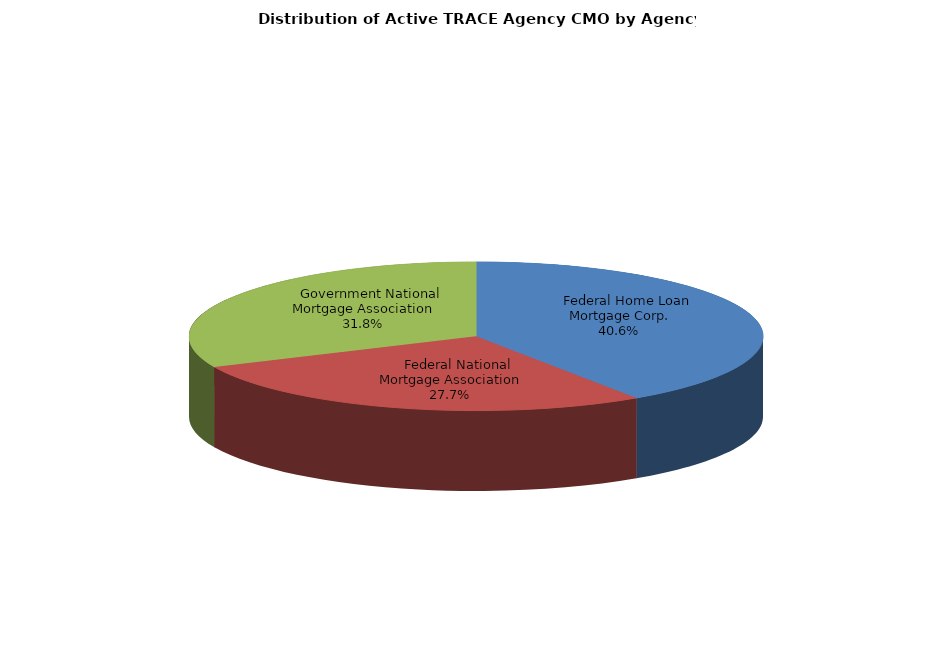
| Category | Series 0 |
|---|---|
|     Federal Home Loan Mortgage Corp. | 73214 |
|     Federal National Mortgage Association | 49970 |
|     Government National Mortgage Association | 57319 |